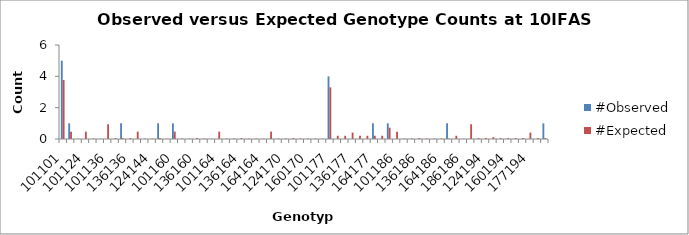
| Category | #Observed | #Expected |
|---|---|---|
| 101101.0 | 5 | 3.765 |
| 101105.0 | 1 | 0.471 |
| 105105.0 | 0 | 0.015 |
| 101124.0 | 0 | 0.471 |
| 105124.0 | 0 | 0.029 |
| 124124.0 | 0 | 0.015 |
| 101136.0 | 0 | 0.941 |
| 105136.0 | 0 | 0.059 |
| 124136.0 | 1 | 0.059 |
| 136136.0 | 0 | 0.059 |
| 101144.0 | 0 | 0.471 |
| 105144.0 | 0 | 0.029 |
| 124144.0 | 0 | 0.029 |
| 136144.0 | 1 | 0.059 |
| 144144.0 | 0 | 0.015 |
| 101160.0 | 1 | 0.471 |
| 105160.0 | 0 | 0.029 |
| 124160.0 | 0 | 0.029 |
| 136160.0 | 0 | 0.059 |
| 144160.0 | 0 | 0.029 |
| 160160.0 | 0 | 0.015 |
| 101164.0 | 0 | 0.471 |
| 105164.0 | 0 | 0.029 |
| 124164.0 | 0 | 0.029 |
| 136164.0 | 0 | 0.059 |
| 144164.0 | 0 | 0.029 |
| 160164.0 | 0 | 0.029 |
| 164164.0 | 0 | 0.015 |
| 101170.0 | 0 | 0.471 |
| 105170.0 | 0 | 0.029 |
| 124170.0 | 0 | 0.029 |
| 136170.0 | 0 | 0.059 |
| 144170.0 | 0 | 0.029 |
| 160170.0 | 0 | 0.029 |
| 164170.0 | 0 | 0.029 |
| 170170.0 | 0 | 0.015 |
| 101177.0 | 4 | 3.294 |
| 105177.0 | 0 | 0.206 |
| 124177.0 | 0 | 0.206 |
| 136177.0 | 0 | 0.412 |
| 144177.0 | 0 | 0.206 |
| 160177.0 | 0 | 0.206 |
| 164177.0 | 1 | 0.206 |
| 170177.0 | 0 | 0.206 |
| 177177.0 | 1 | 0.721 |
| 101186.0 | 0 | 0.471 |
| 105186.0 | 0 | 0.029 |
| 124186.0 | 0 | 0.029 |
| 136186.0 | 0 | 0.059 |
| 144186.0 | 0 | 0.029 |
| 160186.0 | 0 | 0.029 |
| 164186.0 | 0 | 0.029 |
| 170186.0 | 1 | 0.029 |
| 177186.0 | 0 | 0.206 |
| 186186.0 | 0 | 0.015 |
| 101194.0 | 0 | 0.941 |
| 105194.0 | 0 | 0.059 |
| 124194.0 | 0 | 0.059 |
| 136194.0 | 0 | 0.118 |
| 144194.0 | 0 | 0.059 |
| 160194.0 | 0 | 0.059 |
| 164194.0 | 0 | 0.059 |
| 170194.0 | 0 | 0.059 |
| 177194.0 | 0 | 0.412 |
| 186194.0 | 0 | 0.059 |
| 194194.0 | 1 | 0.059 |